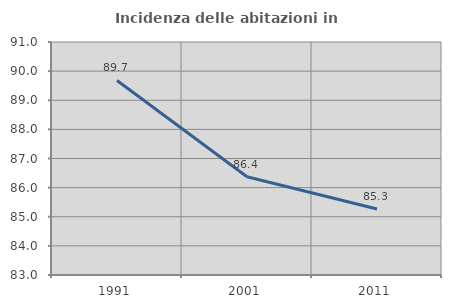
| Category | Incidenza delle abitazioni in proprietà  |
|---|---|
| 1991.0 | 89.68 |
| 2001.0 | 86.373 |
| 2011.0 | 85.269 |